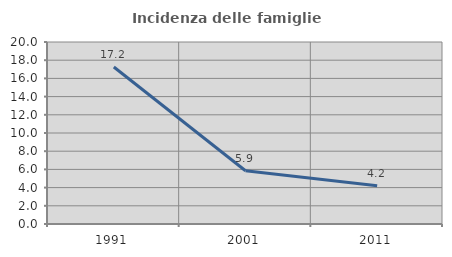
| Category | Incidenza delle famiglie numerose |
|---|---|
| 1991.0 | 17.248 |
| 2001.0 | 5.852 |
| 2011.0 | 4.215 |